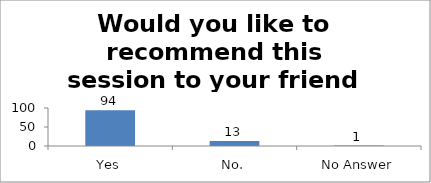
| Category | Would you like to recommend this session to your friend or colleague? |
|---|---|
| Yes | 94 |
| No. | 13 |
| No Answer | 1 |